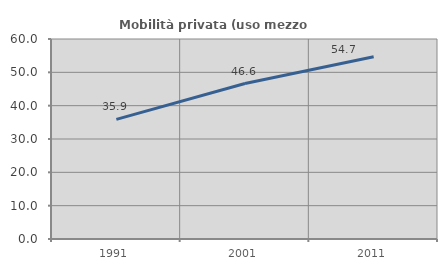
| Category | Mobilità privata (uso mezzo privato) |
|---|---|
| 1991.0 | 35.884 |
| 2001.0 | 46.636 |
| 2011.0 | 54.666 |